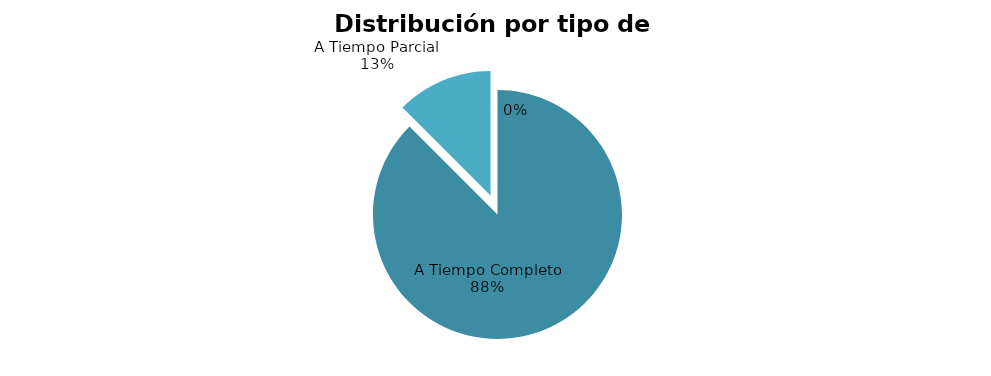
| Category | 7 |
|---|---|
| A Tiempo Completo | 7 |
| A Tiempo Parcial | 1 |